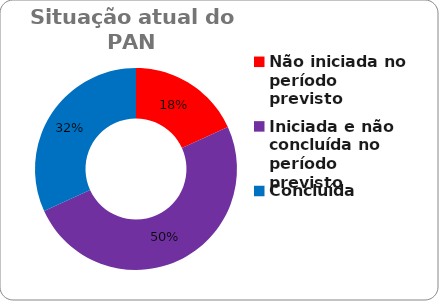
| Category | Series 0 |
|---|---|
| Não iniciada no período previsto | 0.182 |
| Iniciada e não concluída no período previsto | 0.5 |
| Concluída | 0.318 |